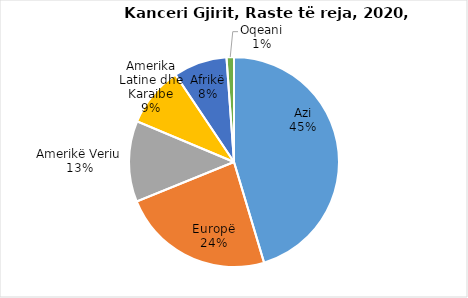
| Category |  Raste të reja 2020  |
|---|---|
| Azi | 1026171 |
| Europë | 531086 |
| Amerikë Veriu | 281591 |
| Amerika Latine dhe Karaibe | 210100 |
| Afrikë | 186598 |
| Oqeani | 25873 |